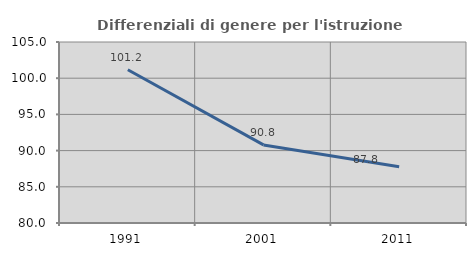
| Category | Differenziali di genere per l'istruzione superiore |
|---|---|
| 1991.0 | 101.174 |
| 2001.0 | 90.786 |
| 2011.0 | 87.781 |